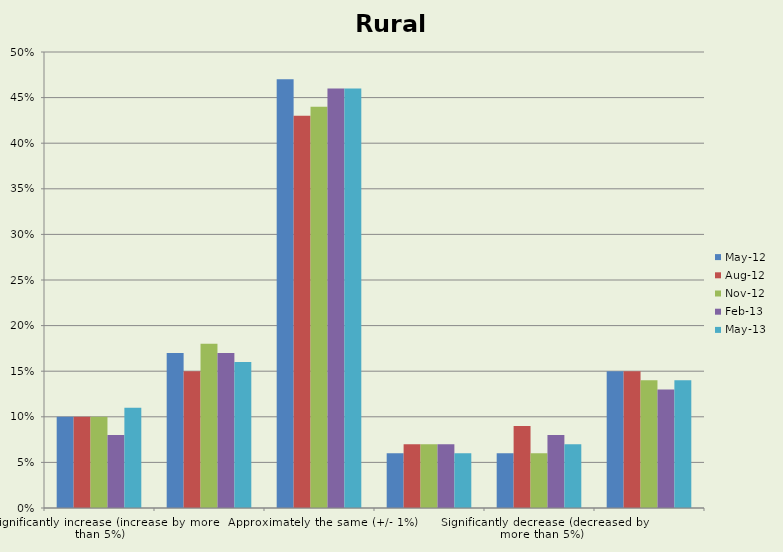
| Category | May-12 | Aug-12 | Nov-12 | Feb-13 | May-13 |
|---|---|---|---|---|---|
| Significantly increase (increase by more than 5%) | 0.1 | 0.1 | 0.1 | 0.08 | 0.11 |
| Slightly increase (increased by 1% - 5%) | 0.17 | 0.15 | 0.18 | 0.17 | 0.16 |
| Approximately the same (+/- 1%) | 0.47 | 0.43 | 0.44 | 0.46 | 0.46 |
| Slightly decrease (decreased by 1% - 5%) | 0.06 | 0.07 | 0.07 | 0.07 | 0.06 |
| Significantly decrease (decreased by more than 5%) | 0.06 | 0.09 | 0.06 | 0.08 | 0.07 |
| Unsure/not applicable | 0.15 | 0.15 | 0.14 | 0.13 | 0.14 |